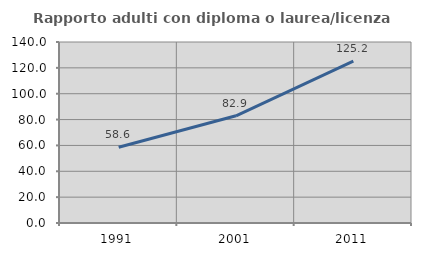
| Category | Rapporto adulti con diploma o laurea/licenza media  |
|---|---|
| 1991.0 | 58.612 |
| 2001.0 | 82.936 |
| 2011.0 | 125.154 |